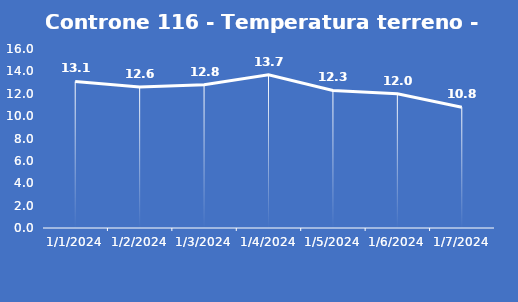
| Category | Controne 116 - Temperatura terreno - Grezzo (°C) |
|---|---|
| 1/1/24 | 13.1 |
| 1/2/24 | 12.6 |
| 1/3/24 | 12.8 |
| 1/4/24 | 13.7 |
| 1/5/24 | 12.3 |
| 1/6/24 | 12 |
| 1/7/24 | 10.8 |